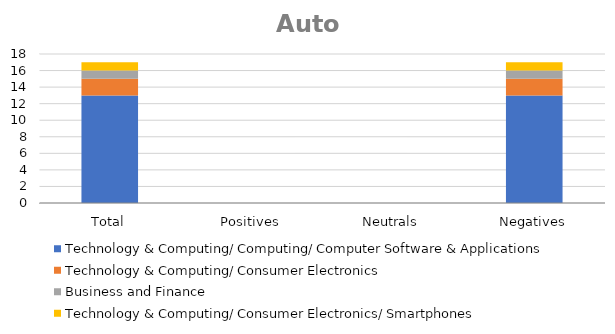
| Category | Technology & Computing/ Computing/ Computer Software & Applications | Technology & Computing/ Consumer Electronics | Business and Finance | Technology & Computing/ Consumer Electronics/ Smartphones |
|---|---|---|---|---|
| Total | 13 | 2 | 1 | 1 |
| Positives | 0 | 0 | 0 | 0 |
| Neutrals | 0 | 0 | 0 | 0 |
| Negatives | 13 | 2 | 1 | 1 |